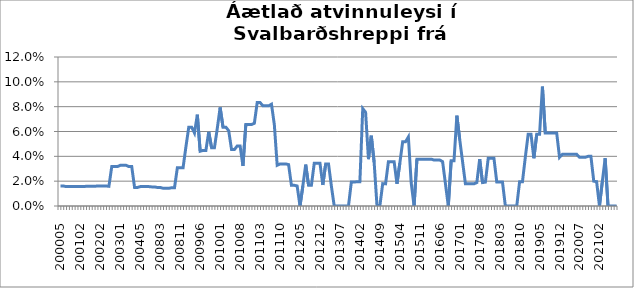
| Category | Series 0 |
|---|---|
| 200005 | 0.016 |
| 200006 | 0.016 |
| 200008 | 0.016 |
| 200009 | 0.016 |
| 200010 | 0.016 |
| 200012 | 0.016 |
| 200101 | 0.016 |
| 200102 | 0.016 |
| 200106 | 0.016 |
| 200107 | 0.016 |
| 200108 | 0.016 |
| 200111 | 0.016 |
| 200112 | 0.016 |
| 200201 | 0.016 |
| 200202 | 0.016 |
| 200203 | 0.016 |
| 200204 | 0.016 |
| 200209 | 0.016 |
| 200210 | 0.032 |
| 200211 | 0.032 |
| 200212 | 0.032 |
| 200301 | 0.033 |
| 200302 | 0.033 |
| 200303 | 0.033 |
| 200304 | 0.032 |
| 200305 | 0.032 |
| 200308 | 0.015 |
| 200309 | 0.015 |
| 200405 | 0.016 |
| 200406 | 0.016 |
| 200407 | 0.016 |
| 200512 | 0.016 |
| 200610 | 0.015 |
| 200611 | 0.015 |
| 200802 | 0.015 |
| 200803 | 0.015 |
| 200804 | 0.014 |
| 200805 | 0.014 |
| 200806 | 0.014 |
| 200808 | 0.015 |
| 200809 | 0.015 |
| 200810 | 0.031 |
| 200811 | 0.031 |
| 200812 | 0.031 |
| 200901 | 0.048 |
| 200902 | 0.063 |
| 200903 | 0.063 |
| 200904 | 0.059 |
| 200905 | 0.074 |
| 200906 | 0.044 |
| 200907 | 0.045 |
| 200908 | 0.045 |
| 200909 | 0.06 |
| 200910 | 0.047 |
| 200911 | 0.047 |
| 200912 | 0.062 |
| 201001 | 0.079 |
| 201002 | 0.063 |
| 201003 | 0.063 |
| 201004 | 0.061 |
| 201005 | 0.045 |
| 201006 | 0.045 |
| 201007 | 0.048 |
| 201008 | 0.048 |
| 201009 | 0.032 |
| 201010 | 0.066 |
| 201011 | 0.066 |
| 201012 | 0.066 |
| 201101 | 0.067 |
| 201102 | 0.083 |
| 201103 | 0.083 |
| 201104 | 0.081 |
| 201105 | 0.081 |
| 201106 | 0.081 |
| 201107 | 0.082 |
| 201108 | 0.066 |
| 201109 | 0.033 |
| 201110 | 0.034 |
| 201111 | 0.034 |
| 201112 | 0.034 |
| 201201 | 0.033 |
| 201202 | 0.017 |
| 201203 | 0.017 |
| 201204 | 0.016 |
| 201205 | 0 |
| 201206 | 0.016 |
| 201207 | 0.033 |
| 201208 | 0.017 |
| 201209 | 0.017 |
| 201210 | 0.034 |
| 201211 | 0.034 |
| 201212 | 0.034 |
| 201301 | 0.017 |
| 201302 | 0.034 |
| 201303 | 0.034 |
| 201304 | 0.016 |
| 201305 | 0 |
| 201306 | 0 |
| 201307 | 0 |
| 201308 | 0 |
| 201309 | 0 |
| 201310 | 0 |
| 201311 | 0.019 |
| 201312 | 0.019 |
| 201401 | 0.02 |
| 201402 | 0.02 |
| 201403 | 0.078 |
| 201404 | 0.075 |
| 201405 | 0.038 |
| 201406 | 0.057 |
| 201407 | 0.035 |
| 201408 | 0 |
| 201409 | 0 |
| 201410 | 0.018 |
| 201411 | 0.018 |
| 201412 | 0.036 |
| 201501 | 0.036 |
| 201502 | 0.036 |
| 201503 | 0.018 |
| 201504 | 0.034 |
| 201505 | 0.052 |
| 201506 | 0.052 |
| 201507 | 0.056 |
| 201508 | 0.019 |
| 201509 | 0 |
| 201510 | 0.038 |
| 201511 | 0.038 |
| 201512 | 0.038 |
| 201601 | 0.038 |
| 201602 | 0.038 |
| 201603 | 0.038 |
| 201604 | 0.037 |
| 201605 | 0.037 |
| 201606 | 0.037 |
| 201607 | 0.036 |
| 201608 | 0.018 |
| 201609 | 0 |
| 201610 | 0.036 |
| 201611 | 0.036 |
| 201612 | 0.073 |
| 201701 | 0.054 |
| 201702 | 0.036 |
| 201703 | 0.018 |
| 201704 | 0.018 |
| 201705 | 0.018 |
| 201706 | 0.018 |
| 201707 | 0.019 |
| 201708 | 0.038 |
| 201709 | 0.019 |
| 201710 | 0.019 |
| 201711 | 0.038 |
| 201712 | 0.038 |
| 201801 | 0.038 |
| 201802 | 0.019 |
| 201803 | 0.019 |
| 201804 | 0.019 |
| 201805 | 0 |
| 201806 | 0 |
| 201807 | 0 |
| 201808 | 0 |
| 201809 | 0 |
| 201810 | 0.02 |
| 201811 | 0.02 |
| 201812 | 0.039 |
| 201901 | 0.058 |
| 201902 | 0.058 |
| 201903 | 0.038 |
| 201904 | 0.058 |
| 201905 | 0.058 |
| 201906 | 0.096 |
| 201907 | 0.059 |
| 201908 | 0.059 |
| 201909 | 0.059 |
| 201910 | 0.059 |
| 201911 | 0.059 |
| 201912 | 0.039 |
| 202001 | 0.042 |
| 202002 | 0.042 |
| 202003 | 0.042 |
| 202004 | 0.042 |
| 202005 | 0.042 |
| 202006 | 0.042 |
| 202007 | 0.039 |
| 202008 | 0.039 |
| 202009 | 0.039 |
| 202010 | 0.04 |
| 202011 | 0.04 |
| 202012 | 0.02 |
| 202101 | 0.02 |
| 202102 | 0 |
| 202103 | 0.02 |
| 202104 | 0.038 |
| 202105 | 0 |
| 202106 | 0 |
| 202107 | 0 |
| 202108 | 0 |